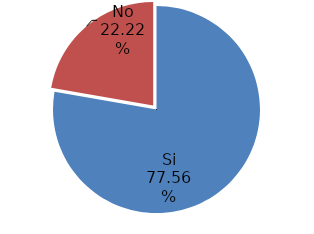
| Category | Series 0 |
|---|---|
| Si | 0.776 |
| No | 0.222 |